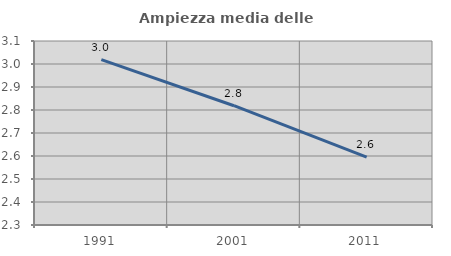
| Category | Ampiezza media delle famiglie |
|---|---|
| 1991.0 | 3.019 |
| 2001.0 | 2.819 |
| 2011.0 | 2.595 |